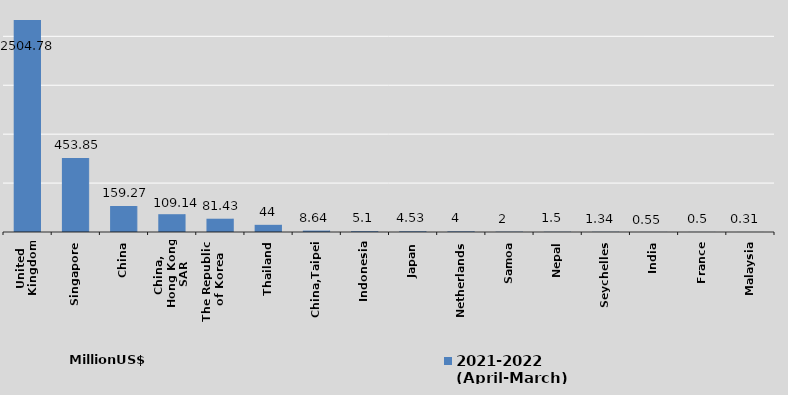
| Category | 2021-2022
(April-March)
 |
|---|---|
| United Kingdom | 2504.78 |
| Singapore | 453.85 |
| China | 159.27 |
| China, 
Hong Kong SAR | 109.14 |
| The Republic 
of Korea | 81.43 |
| Thailand | 44 |
| China,Taipei | 8.64 |
| Indonesia | 5.1 |
| Japan | 4.53 |
| Netherlands | 4 |
| Samoa | 2 |
| Nepal | 1.5 |
| Seychelles | 1.34 |
| India | 0.55 |
| France | 0.5 |
| Malaysia | 0.31 |